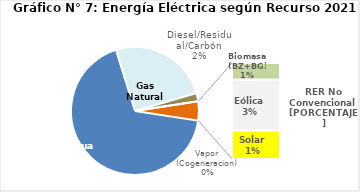
| Category | Series 0 |
|---|---|
| Agua | 3012.017 |
| Gas Natural | 1124.134 |
| Diesel/Residual/Carbón | 92.56 |
| Vapor (Cogeneracion) | 0.24 |
| Biomasa (BZ+BG) | 37.68 |
| Eólica | 114.153 |
| Solar | 63.768 |